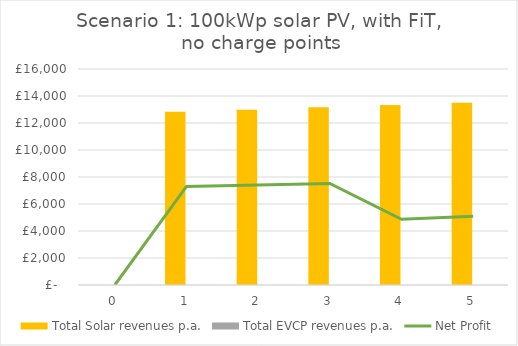
| Category | Total Solar revenues p.a. | Total EVCP revenues p.a. |
|---|---|---|
| 0.0 | 0 | 0 |
| 1.0 | 12825 | 0 |
| 2.0 | 12990.656 | 0 |
| 3.0 | 13158.991 | 0 |
| 4.0 | 13330.042 | 0 |
| 5.0 | 13503.846 | 0 |